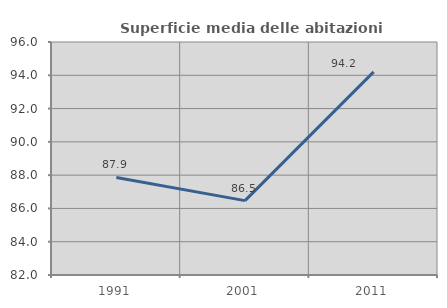
| Category | Superficie media delle abitazioni occupate |
|---|---|
| 1991.0 | 87.863 |
| 2001.0 | 86.469 |
| 2011.0 | 94.204 |